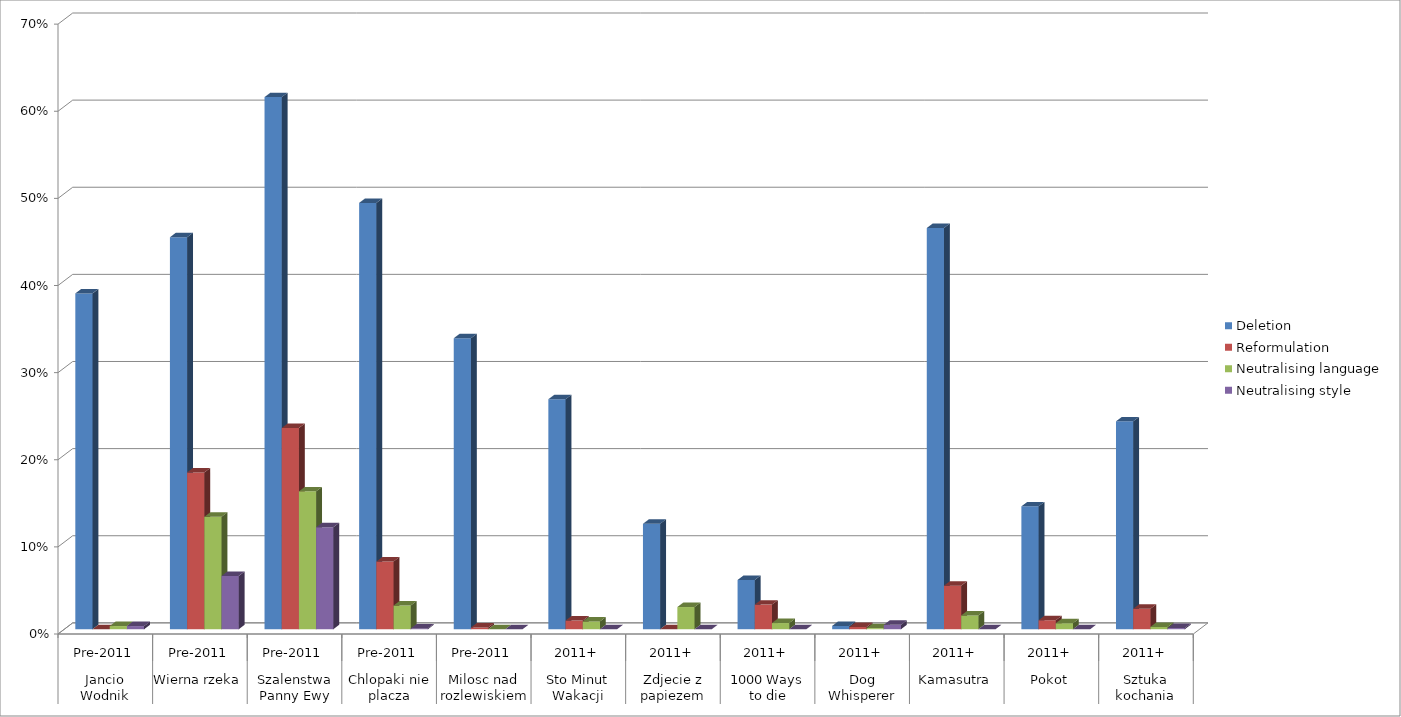
| Category | Deletion | Reformulation | Neutralising language | Neutralising style |
|---|---|---|---|---|
| 0 | 0.385 | 0 | 0.004 | 0.004 |
| 1 | 0.45 | 0.18 | 0.129 | 0.061 |
| 2 | 0.611 | 0.231 | 0.158 | 0.117 |
| 3 | 0.489 | 0.078 | 0.027 | 0.001 |
| 4 | 0.334 | 0.002 | 0 | 0 |
| 5 | 0.264 | 0.01 | 0.009 | 0 |
| 6 | 0.121 | 0 | 0.025 | 0 |
| 7 | 0.057 | 0.028 | 0.007 | 0 |
| 8 | 0.004 | 0.003 | 0.001 | 0.005 |
| 9 | 0.461 | 0.05 | 0.016 | 0 |
| 10 | 0.141 | 0.01 | 0.007 | 0 |
| 11 | 0.239 | 0.023 | 0.003 | 0.001 |